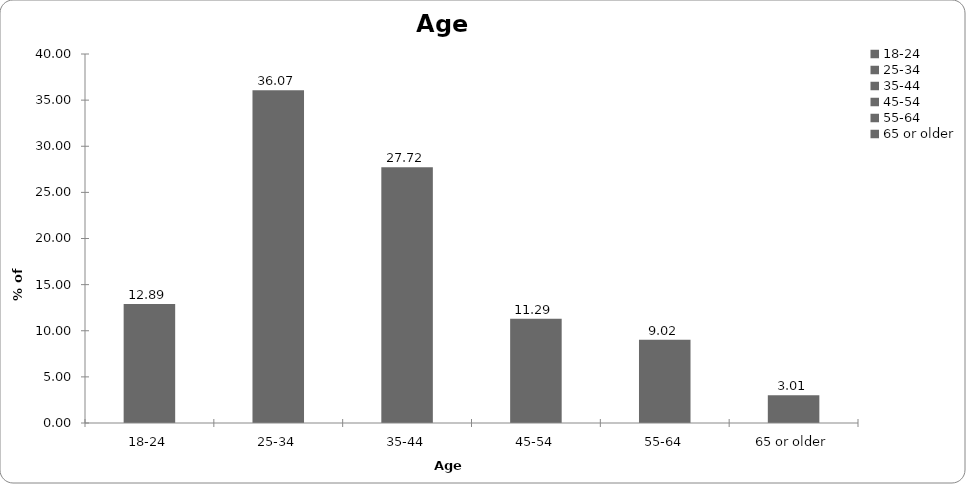
| Category | Age range |
|---|---|
| 18-24 | 12.892 |
| 25-34 | 36.072 |
| 35-44 | 27.722 |
| 45-54 | 11.289 |
| 55-64 | 9.018 |
| 65 or older | 3.006 |